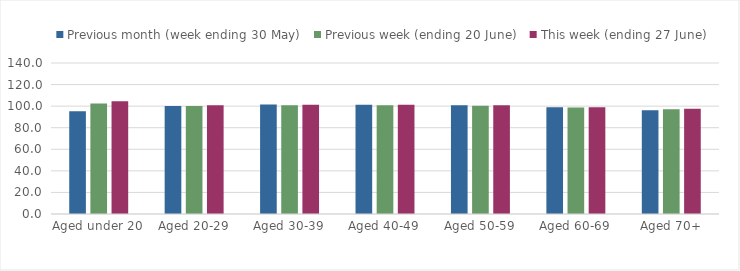
| Category | Previous month (week ending 30 May) | Previous week (ending 20 June) | This week (ending 27 June) |
|---|---|---|---|
| Aged under 20 | 95.317 | 102.532 | 104.556 |
| Aged 20-29 | 100.056 | 100.203 | 100.83 |
| Aged 30-39 | 101.417 | 100.936 | 101.346 |
| Aged 40-49 | 101.248 | 100.863 | 101.249 |
| Aged 50-59 | 100.788 | 100.388 | 100.826 |
| Aged 60-69 | 99.029 | 98.731 | 99.066 |
| Aged 70+ | 96.158 | 97.225 | 97.582 |